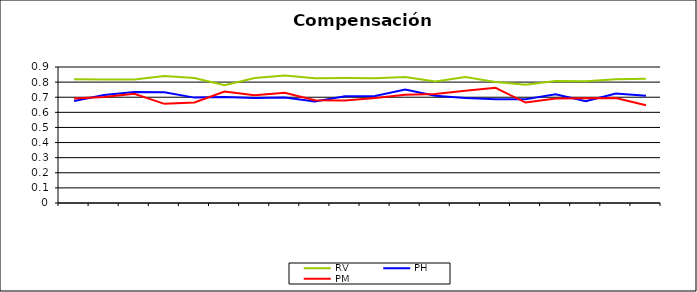
| Category | RV | PH | PM |
|---|---|---|---|
| 0 | 0.819 | 0.675 | 0.691 |
| 1 | 0.818 | 0.714 | 0.701 |
| 2 | 0.817 | 0.734 | 0.722 |
| 3 | 0.84 | 0.732 | 0.656 |
| 4 | 0.827 | 0.697 | 0.666 |
| 5 | 0.78 | 0.701 | 0.737 |
| 6 | 0.827 | 0.695 | 0.713 |
| 7 | 0.844 | 0.699 | 0.73 |
| 8 | 0.826 | 0.672 | 0.68 |
| 9 | 0.827 | 0.706 | 0.678 |
| 10 | 0.826 | 0.709 | 0.696 |
| 11 | 0.834 | 0.751 | 0.717 |
| 12 | 0.804 | 0.709 | 0.721 |
| 13 | 0.834 | 0.694 | 0.743 |
| 14 | 0.802 | 0.687 | 0.763 |
| 15 | 0.783 | 0.687 | 0.665 |
| 16 | 0.807 | 0.72 | 0.692 |
| 17 | 0.805 | 0.674 | 0.693 |
| 18 | 0.82 | 0.724 | 0.695 |
| 19 | 0.822 | 0.71 | 0.646 |